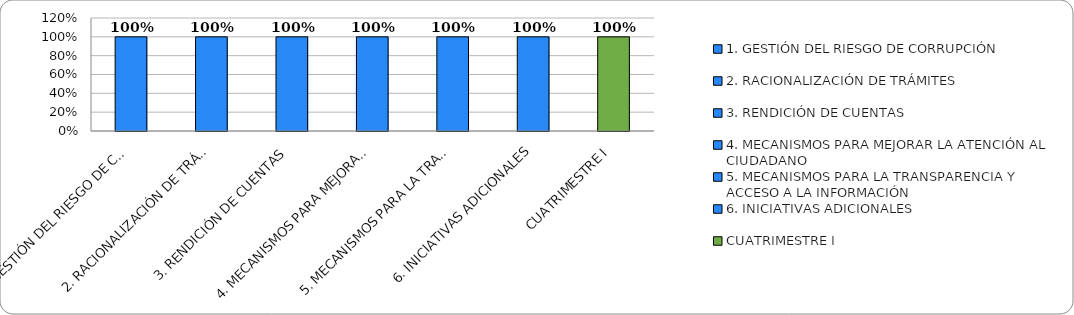
| Category | Series 0 |
|---|---|
| 1. GESTIÓN DEL RIESGO DE CORRUPCIÓN | 1 |
| 2. RACIONALIZACIÓN DE TRÁMITES | 1 |
| 3. RENDICIÓN DE CUENTAS | 1 |
| 4. MECANISMOS PARA MEJORAR LA ATENCIÓN AL CIUDADANO | 1 |
| 5. MECANISMOS PARA LA TRANSPARENCIA Y ACCESO A LA INFORMACIÓN | 1 |
| 6. INICIATIVAS ADICIONALES | 1 |
| CUATRIMESTRE I | 1 |